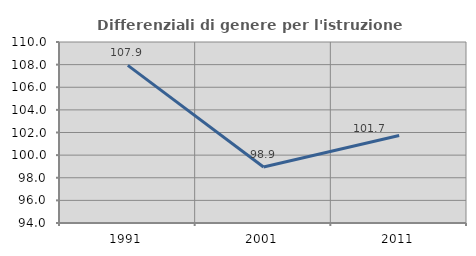
| Category | Differenziali di genere per l'istruzione superiore |
|---|---|
| 1991.0 | 107.934 |
| 2001.0 | 98.944 |
| 2011.0 | 101.728 |